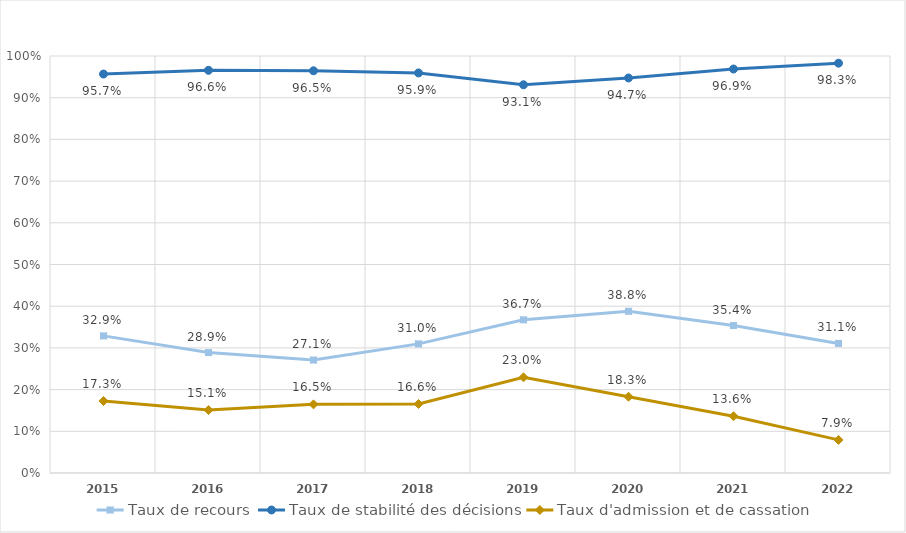
| Category | Taux de recours | Taux de stabilité des décisions | Taux d'admission et de cassation |
|---|---|---|---|
| 2015.0 | 0.329 | 0.957 | 0.173 |
| 2016.0 | 0.289 | 0.966 | 0.151 |
| 2017.0 | 0.271 | 0.965 | 0.165 |
| 2018.0 | 0.31 | 0.959 | 0.166 |
| 2019.0 | 0.367 | 0.931 | 0.23 |
| 2020.0 | 0.388 | 0.947 | 0.183 |
| 2021.0 | 0.354 | 0.969 | 0.136 |
| 2022.0 | 0.311 | 0.983 | 0.079 |